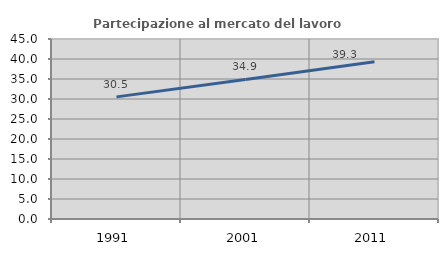
| Category | Partecipazione al mercato del lavoro  femminile |
|---|---|
| 1991.0 | 30.531 |
| 2001.0 | 34.902 |
| 2011.0 | 39.313 |